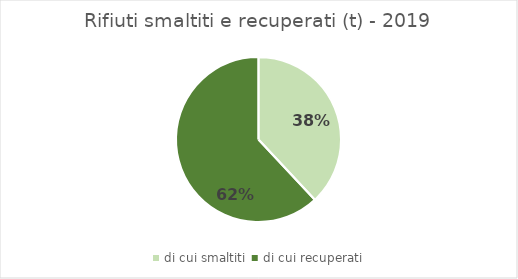
| Category | di cui smaltiti |
|---|---|
| di cui smaltiti  | 146265 |
| di cui recuperati | 238260 |